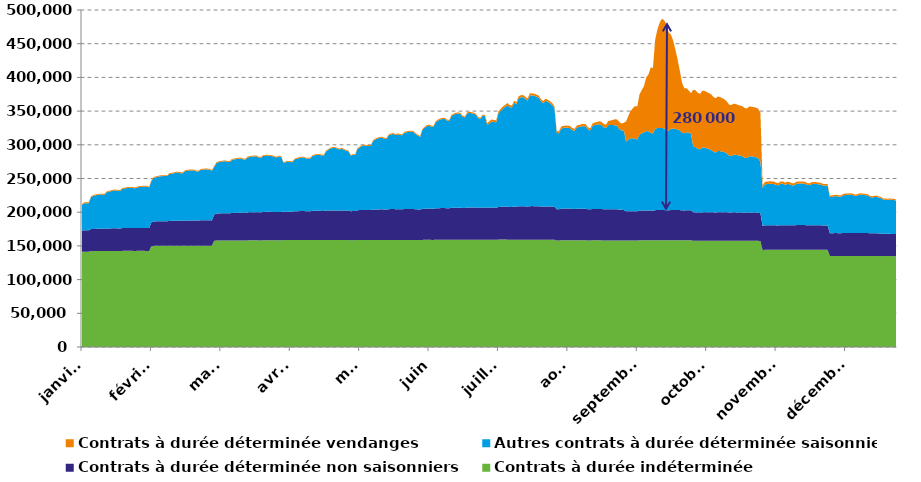
| Category | Contrats à durée indéterminée | Contrats à durée déterminée non saisonniers | Autres contrats à durée déterminée saisonniers | Contrats à durée déterminée vendanges |
|---|---|---|---|---|
| janvier | 141117 | 31510 | 38198 | 1278 |
| janvier | 141502 | 31786 | 40086 | 1282 |
| janvier | 141489 | 31743 | 40183 | 1281 |
| janvier | 141477 | 31708 | 40238 | 1281 |
| janvier | 142179 | 32746 | 47316 | 1327 |
| janvier | 142261 | 32906 | 48820 | 1330 |
| janvier | 142293 | 32949 | 49689 | 1332 |
| janvier | 142324 | 33006 | 50367 | 1333 |
| janvier | 142340 | 33022 | 50820 | 1336 |
| janvier | 142313 | 32969 | 50683 | 1334 |
| janvier | 142301 | 32940 | 50630 | 1334 |
| janvier | 142457 | 33341 | 53659 | 1341 |
| janvier | 142499 | 33431 | 54517 | 1343 |
| janvier | 142504 | 33492 | 55185 | 1344 |
| janvier | 142555 | 33581 | 55997 | 1345 |
| janvier | 142529 | 33579 | 56105 | 1344 |
| janvier | 142477 | 33471 | 55743 | 1341 |
| janvier | 142468 | 33442 | 55686 | 1341 |
| janvier | 142622 | 33810 | 57917 | 1344 |
| janvier | 142641 | 33882 | 58726 | 1343 |
| janvier | 142654 | 33921 | 59135 | 1341 |
| janvier | 142651 | 33945 | 59508 | 1345 |
| janvier | 142642 | 33945 | 59572 | 1341 |
| janvier | 142604 | 33879 | 59226 | 1336 |
| janvier | 142596 | 33865 | 59206 | 1333 |
| janvier | 142657 | 34041 | 60270 | 1334 |
| janvier | 142647 | 34062 | 60708 | 1336 |
| janvier | 142641 | 34089 | 61092 | 1334 |
| janvier | 142617 | 34107 | 61245 | 1334 |
| janvier | 142599 | 34091 | 61166 | 1332 |
| janvier | 142538 | 33958 | 60202 | 1326 |
| février | 149557 | 35525 | 61177 | 1347 |
| février | 150037 | 36196 | 64528 | 1350 |
| février | 150070 | 36342 | 65362 | 1355 |
| février | 150089 | 36434 | 66019 | 1355 |
| février | 150107 | 36500 | 66679 | 1357 |
| février | 150104 | 36530 | 66909 | 1359 |
| février | 150079 | 36459 | 67054 | 1358 |
| février | 150066 | 36444 | 67035 | 1357 |
| février | 150195 | 36894 | 69413 | 1360 |
| février | 150201 | 36981 | 70002 | 1361 |
| février | 150205 | 37051 | 70422 | 1359 |
| février | 150206 | 37098 | 71239 | 1359 |
| février | 150206 | 37125 | 71273 | 1356 |
| février | 150165 | 37004 | 70735 | 1352 |
| février | 150157 | 36988 | 70634 | 1350 |
| février | 150271 | 37417 | 73096 | 1354 |
| février | 150295 | 37487 | 73682 | 1357 |
| février | 150295 | 37516 | 74171 | 1353 |
| février | 150296 | 37556 | 74146 | 1355 |
| février | 150265 | 37569 | 74138 | 1353 |
| février | 150225 | 37409 | 72913 | 1349 |
| février | 150217 | 37377 | 72639 | 1349 |
| février | 150294 | 37723 | 74647 | 1356 |
| février | 150279 | 37782 | 75059 | 1356 |
| février | 150267 | 37798 | 75315 | 1356 |
| février | 150255 | 37796 | 75268 | 1357 |
| février | 150238 | 37787 | 75011 | 1356 |
| février | 150181 | 37563 | 73493 | 1352 |
| mars | 157490 | 38965 | 70534 | 1324 |
| mars | 157959 | 39990 | 74693 | 1330 |
| mars | 157994 | 40160 | 75979 | 1336 |
| mars | 158016 | 40283 | 76419 | 1337 |
| mars | 158037 | 40396 | 76838 | 1336 |
| mars | 158041 | 40425 | 77119 | 1335 |
| mars | 158009 | 40342 | 76371 | 1328 |
| mars | 158003 | 40324 | 76141 | 1326 |
| mars | 158131 | 40760 | 78715 | 1334 |
| mars | 158125 | 40891 | 79372 | 1334 |
| mars | 158117 | 40951 | 79779 | 1330 |
| mars | 158119 | 41028 | 80291 | 1331 |
| mars | 158104 | 41089 | 80306 | 1325 |
| mars | 158069 | 40947 | 79307 | 1315 |
| mars | 158057 | 40950 | 79079 | 1314 |
| mars | 158197 | 41508 | 81454 | 1318 |
| mars | 158213 | 41672 | 82088 | 1311 |
| mars | 158227 | 41766 | 82492 | 1309 |
| mars | 158227 | 41842 | 82667 | 1307 |
| mars | 158232 | 41861 | 82552 | 1301 |
| mars | 158182 | 41741 | 81205 | 1295 |
| mars | 158173 | 41704 | 80911 | 1295 |
| mars | 158267 | 42145 | 83217 | 1300 |
| mars | 158301 | 42218 | 83247 | 1300 |
| mars | 158299 | 42248 | 83207 | 1297 |
| mars | 158294 | 42253 | 83044 | 1296 |
| mars | 158277 | 42242 | 82570 | 1293 |
| mars | 158228 | 42091 | 81425 | 1283 |
| mars | 158208 | 42046 | 81048 | 1280 |
| mars | 158242 | 42236 | 82040 | 1280 |
| mars | 158226 | 42203 | 81306 | 1274 |
| avril | 158646 | 42044 | 72327 | 1240 |
| avril | 158664 | 42139 | 73367 | 1245 |
| avril | 158665 | 42171 | 73932 | 1245 |
| avril | 158637 | 42115 | 73616 | 1243 |
| avril | 158620 | 42100 | 73513 | 1244 |
| avril | 158771 | 42622 | 76893 | 1250 |
| avril | 158779 | 42716 | 77977 | 1252 |
| avril | 158787 | 42801 | 78718 | 1252 |
| avril | 158804 | 42891 | 79274 | 1249 |
| avril | 158807 | 42912 | 79317 | 1246 |
| avril | 158736 | 42730 | 78313 | 1243 |
| avril | 158722 | 42710 | 78088 | 1243 |
| avril | 158730 | 42709 | 78321 | 1243 |
| avril | 158844 | 43176 | 81264 | 1248 |
| avril | 158870 | 43334 | 82345 | 1254 |
| avril | 158846 | 43329 | 82838 | 1249 |
| avril | 158837 | 43325 | 83100 | 1250 |
| avril | 158808 | 43124 | 82303 | 1247 |
| avril | 158790 | 43047 | 82273 | 1247 |
| avril | 158888 | 43545 | 87783 | 1255 |
| avril | 158882 | 43634 | 89931 | 1256 |
| avril | 158873 | 43685 | 91952 | 1255 |
| avril | 158861 | 43722 | 92730 | 1256 |
| avril | 158847 | 43712 | 92991 | 1256 |
| avril | 158797 | 43559 | 91845 | 1256 |
| avril | 158784 | 43499 | 90824 | 1255 |
| avril | 158812 | 43697 | 91557 | 1263 |
| avril | 158810 | 43655 | 90240 | 1265 |
| avril | 158784 | 43632 | 88573 | 1266 |
| avril | 158760 | 43617 | 87986 | 1267 |
| mai | 158353 | 43135 | 82483 | 1259 |
| mai | 158414 | 43234 | 83212 | 1261 |
| mai | 158418 | 43223 | 83165 | 1261 |
| mai | 158763 | 44203 | 90587 | 1323 |
| mai | 158786 | 44368 | 92829 | 1332 |
| mai | 158807 | 44562 | 94649 | 1342 |
| mai | 158806 | 44589 | 95616 | 1348 |
| mai | 158774 | 44501 | 94784 | 1347 |
| mai | 158782 | 44516 | 94996 | 1347 |
| mai | 158763 | 44501 | 94881 | 1347 |
| mai | 158858 | 45059 | 101645 | 1386 |
| mai | 158864 | 45183 | 103699 | 1399 |
| mai | 158843 | 45258 | 105142 | 1406 |
| mai | 158841 | 45333 | 106083 | 1411 |
| mai | 158853 | 45391 | 106209 | 1412 |
| mai | 158795 | 45248 | 104975 | 1412 |
| mai | 158784 | 45203 | 104765 | 1411 |
| mai | 158881 | 45631 | 109564 | 1439 |
| mai | 158887 | 45739 | 110764 | 1444 |
| mai | 158888 | 45794 | 111343 | 1447 |
| mai | 158852 | 45653 | 109859 | 1444 |
| mai | 158858 | 45710 | 110919 | 1446 |
| mai | 158836 | 45612 | 110052 | 1445 |
| mai | 158829 | 45565 | 109623 | 1446 |
| mai | 158886 | 45872 | 113034 | 1462 |
| mai | 158879 | 45925 | 113832 | 1470 |
| mai | 158881 | 45958 | 114348 | 1476 |
| mai | 158861 | 45961 | 114662 | 1474 |
| mai | 158855 | 45863 | 114204 | 1471 |
| mai | 158807 | 45564 | 111559 | 1467 |
| mai | 158769 | 45381 | 109541 | 1464 |
| juin | 158690 | 45228 | 107515 | 1504 |
| juin | 158926 | 46030 | 116941 | 1543 |
| juin | 158962 | 46227 | 120085 | 1548 |
| juin | 158972 | 46375 | 122162 | 1557 |
| juin | 158969 | 46430 | 123014 | 1559 |
| juin | 158939 | 46295 | 121786 | 1557 |
| juin | 158922 | 46254 | 121334 | 1558 |
| juin | 159033 | 46712 | 128058 | 1577 |
| juin | 159042 | 46845 | 130046 | 1589 |
| juin | 159048 | 46994 | 131442 | 1599 |
| juin | 159043 | 47036 | 132153 | 1607 |
| juin | 159034 | 47060 | 132368 | 1609 |
| juin | 158986 | 46846 | 130069 | 1605 |
| juin | 158963 | 46792 | 129489 | 1605 |
| juin | 159107 | 47397 | 136341 | 1630 |
| juin | 159108 | 47446 | 138104 | 1626 |
| juin | 159113 | 47546 | 139231 | 1632 |
| juin | 159126 | 47590 | 139787 | 1639 |
| juin | 159111 | 47553 | 139020 | 1638 |
| juin | 159077 | 47301 | 135268 | 1620 |
| juin | 159056 | 47224 | 134243 | 1617 |
| juin | 159124 | 47743 | 139598 | 1646 |
| juin | 159123 | 47857 | 140360 | 1651 |
| juin | 159117 | 47956 | 139671 | 1653 |
| juin | 159095 | 48001 | 138974 | 1649 |
| juin | 159076 | 48004 | 137290 | 1646 |
| juin | 159025 | 47716 | 132582 | 1636 |
| juin | 159007 | 47647 | 132071 | 1636 |
| juin | 159038 | 48078 | 135974 | 1659 |
| juin | 159023 | 48119 | 135338 | 1662 |
| juillet | 159209 | 47404 | 122459 | 3082 |
| juillet | 159217 | 47558 | 125347 | 3095 |
| juillet | 159231 | 47694 | 127609 | 3098 |
| juillet | 159182 | 47546 | 127020 | 3079 |
| juillet | 159168 | 47514 | 126708 | 3074 |
| juillet | 159317 | 48435 | 139022 | 3121 |
| juillet | 159340 | 48639 | 142336 | 3133 |
| juillet | 159340 | 48747 | 145623 | 3140 |
| juillet | 159334 | 48928 | 147979 | 3139 |
| juillet | 159297 | 48987 | 150618 | 3139 |
| juillet | 159219 | 48667 | 148074 | 3113 |
| juillet | 159206 | 48614 | 147361 | 3111 |
| juillet | 159236 | 49121 | 153844 | 3122 |
| juillet | 159211 | 49038 | 151807 | 3115 |
| juillet | 159286 | 49634 | 159848 | 3143 |
| juillet | 159253 | 49663 | 161498 | 3141 |
| juillet | 159243 | 49675 | 161896 | 3141 |
| juillet | 159185 | 49402 | 159368 | 3118 |
| juillet | 159173 | 49279 | 157249 | 3118 |
| juillet | 159239 | 49723 | 164260 | 3136 |
| juillet | 159244 | 49785 | 164180 | 3138 |
| juillet | 159247 | 49742 | 163694 | 3134 |
| juillet | 159240 | 49658 | 162585 | 3129 |
| juillet | 159230 | 49599 | 161024 | 3119 |
| juillet | 159173 | 49264 | 156115 | 3099 |
| juillet | 159171 | 49150 | 153371 | 3097 |
| juillet | 159204 | 49411 | 156876 | 3111 |
| juillet | 159193 | 49421 | 155157 | 3108 |
| juillet | 159177 | 49353 | 153219 | 3107 |
| juillet | 159148 | 49183 | 150549 | 3103 |
| juillet | 159126 | 49025 | 146288 | 3099 |
| août | 158073 | 46416 | 113390 | 2995 |
| août | 158061 | 46298 | 112559 | 2996 |
| août | 158239 | 47067 | 118689 | 3011 |
| août | 158264 | 47175 | 119494 | 3015 |
| août | 158280 | 47192 | 120067 | 3021 |
| août | 158279 | 47143 | 119928 | 3024 |
| août | 158280 | 47091 | 119330 | 3035 |
| août | 158226 | 46761 | 116749 | 3026 |
| août | 158212 | 46652 | 115844 | 3025 |
| août | 158261 | 46943 | 120469 | 3047 |
| août | 158255 | 46912 | 121233 | 3098 |
| août | 158247 | 46933 | 122168 | 3184 |
| août | 158244 | 46887 | 122594 | 3231 |
| août | 158228 | 46806 | 122251 | 3288 |
| août | 158166 | 46275 | 118210 | 3273 |
| août | 158146 | 46127 | 117074 | 3278 |
| août | 158238 | 46561 | 123047 | 3601 |
| août | 158221 | 46623 | 124429 | 3770 |
| août | 158219 | 46623 | 125118 | 4025 |
| août | 158212 | 46646 | 125551 | 4522 |
| août | 158192 | 46569 | 124549 | 4809 |
| août | 158150 | 46273 | 121687 | 4909 |
| août | 158138 | 46138 | 120602 | 4862 |
| août | 158196 | 46353 | 124602 | 6122 |
| août | 158186 | 46358 | 124763 | 6740 |
| août | 158173 | 46348 | 124808 | 7481 |
| août | 158168 | 46318 | 124563 | 8891 |
| août | 158152 | 46244 | 123578 | 9679 |
| août | 158099 | 45653 | 119317 | 10610 |
| août | 158073 | 45437 | 117690 | 10426 |
| août | 158074 | 45267 | 117930 | 11489 |
| septembre | 158030 | 43213 | 103690 | 29739 |
| septembre | 158064 | 43356 | 106258 | 35120 |
| septembre | 158099 | 43445 | 108047 | 40726 |
| septembre | 158124 | 43471 | 108319 | 44115 |
| septembre | 158108 | 43328 | 107238 | 49035 |
| septembre | 158089 | 43262 | 106608 | 48710 |
| septembre | 158294 | 43916 | 113064 | 59616 |
| septembre | 158328 | 44066 | 114521 | 64261 |
| septembre | 158344 | 44187 | 115884 | 68785 |
| septembre | 158356 | 44329 | 117735 | 79658 |
| septembre | 158340 | 44335 | 117271 | 84512 |
| septembre | 158309 | 44122 | 115146 | 96961 |
| septembre | 158291 | 44006 | 114300 | 97850 |
| septembre | 158470 | 44561 | 120797 | 132137 |
| septembre | 158515 | 44718 | 121792 | 146284 |
| septembre | 158482 | 44721 | 121596 | 156469 |
| septembre | 158484 | 44741 | 121805 | 161932 |
| septembre | 158459 | 44697 | 121083 | 160648 |
| septembre | 158428 | 44454 | 118785 | 157249 |
| septembre | 158407 | 44339 | 118026 | 146326 |
| septembre | 158505 | 44688 | 120584 | 140051 |
| septembre | 158513 | 44733 | 120718 | 131043 |
| septembre | 158519 | 44761 | 120344 | 118143 |
| septembre | 158514 | 44707 | 119605 | 104020 |
| septembre | 158499 | 44626 | 118166 | 88598 |
| septembre | 158442 | 44329 | 115159 | 74088 |
| septembre | 158424 | 44209 | 114273 | 67005 |
| septembre | 158478 | 44391 | 115771 | 65430 |
| septembre | 158470 | 44377 | 115036 | 62611 |
| septembre | 158458 | 44337 | 113594 | 60322 |
| octobre | 157565 | 42194 | 97180 | 84809 |
| octobre | 157561 | 42217 | 96849 | 84401 |
| octobre | 157517 | 42017 | 94458 | 83205 |
| octobre | 157499 | 41949 | 93675 | 82351 |
| octobre | 157629 | 42370 | 96082 | 84072 |
| octobre | 157617 | 42428 | 95833 | 84239 |
| octobre | 157624 | 42422 | 94651 | 83759 |
| octobre | 157629 | 42390 | 93657 | 83022 |
| octobre | 157599 | 42335 | 92509 | 82383 |
| octobre | 157551 | 42133 | 89917 | 81354 |
| octobre | 157515 | 42084 | 88886 | 80687 |
| octobre | 157627 | 42421 | 90835 | 80763 |
| octobre | 157606 | 42470 | 90535 | 80281 |
| octobre | 157609 | 42425 | 89744 | 79454 |
| octobre | 157616 | 42444 | 88997 | 78248 |
| octobre | 157570 | 42268 | 87195 | 77155 |
| octobre | 157520 | 41968 | 84253 | 75880 |
| octobre | 157499 | 41882 | 83690 | 75728 |
| octobre | 157606 | 42170 | 85446 | 75832 |
| octobre | 157591 | 42161 | 85350 | 75438 |
| octobre | 157575 | 42071 | 84671 | 74713 |
| octobre | 157565 | 42042 | 84126 | 74465 |
| octobre | 157548 | 41980 | 83437 | 74166 |
| octobre | 157499 | 41794 | 81418 | 73816 |
| octobre | 157479 | 41741 | 81066 | 73766 |
| octobre | 157535 | 41955 | 83452 | 73818 |
| octobre | 157526 | 41969 | 83400 | 73705 |
| octobre | 157520 | 41933 | 82859 | 73628 |
| octobre | 157493 | 41884 | 82207 | 73501 |
| octobre | 157475 | 41776 | 80966 | 73302 |
| octobre | 157340 | 41220 | 76199 | 72788 |
| novembre | 143728 | 35761 | 56836 | 3743 |
| novembre | 144167 | 36396 | 60559 | 3767 |
| novembre | 144198 | 36438 | 61204 | 3731 |
| novembre | 144215 | 36466 | 61401 | 3709 |
| novembre | 144212 | 36474 | 61409 | 3677 |
| novembre | 144198 | 36474 | 61069 | 3630 |
| novembre | 144150 | 36284 | 59990 | 3470 |
| novembre | 144134 | 36220 | 59486 | 3441 |
| novembre | 144242 | 36535 | 61328 | 3457 |
| novembre | 144249 | 36563 | 61272 | 3419 |
| novembre | 144231 | 36422 | 59907 | 3313 |
| novembre | 144258 | 36537 | 61024 | 3338 |
| novembre | 144243 | 36557 | 60675 | 3306 |
| novembre | 144178 | 36365 | 59396 | 3209 |
| novembre | 144167 | 36322 | 59088 | 3179 |
| novembre | 144298 | 36531 | 61197 | 3205 |
| novembre | 144301 | 36587 | 61488 | 3171 |
| novembre | 144301 | 36578 | 61666 | 3141 |
| novembre | 144298 | 36569 | 61612 | 3087 |
| novembre | 144292 | 36551 | 61182 | 3024 |
| novembre | 144232 | 36339 | 59767 | 2826 |
| novembre | 144212 | 36292 | 59592 | 2818 |
| novembre | 144280 | 36469 | 61140 | 2809 |
| novembre | 144276 | 36497 | 61314 | 2762 |
| novembre | 144260 | 36477 | 61102 | 2711 |
| novembre | 144245 | 36437 | 60706 | 2680 |
| novembre | 144230 | 36390 | 60214 | 2654 |
| novembre | 144176 | 36150 | 59105 | 2601 |
| novembre | 144167 | 36098 | 58946 | 2595 |
| novembre | 144170 | 36116 | 59232 | 2593 |
| décembre | 135034 | 33767 | 53489 | 2164 |
| décembre | 135057 | 33827 | 54134 | 2155 |
| décembre | 135073 | 33890 | 54558 | 2144 |
| décembre | 135082 | 33896 | 54640 | 2132 |
| décembre | 135052 | 33832 | 54101 | 2108 |
| décembre | 135033 | 33809 | 53971 | 2105 |
| décembre | 135114 | 34058 | 55887 | 2107 |
| décembre | 135116 | 34132 | 56306 | 2105 |
| décembre | 135118 | 34172 | 56491 | 2098 |
| décembre | 135104 | 34202 | 56643 | 2092 |
| décembre | 135078 | 34175 | 56394 | 2084 |
| décembre | 135029 | 34042 | 55367 | 2058 |
| décembre | 135013 | 34004 | 55106 | 2055 |
| décembre | 135064 | 34180 | 56495 | 2052 |
| décembre | 135076 | 34214 | 56718 | 2048 |
| décembre | 135040 | 34154 | 56356 | 2030 |
| décembre | 135026 | 34139 | 56003 | 2018 |
| décembre | 135005 | 34074 | 55513 | 1988 |
| décembre | 134946 | 33731 | 53667 | 1878 |
| décembre | 134930 | 33657 | 53273 | 1876 |
| décembre | 134955 | 33750 | 53895 | 1874 |
| décembre | 134936 | 33731 | 53706 | 1859 |
| décembre | 134914 | 33619 | 53152 | 1839 |
| décembre | 134885 | 33444 | 52052 | 1801 |
| décembre | 134861 | 33083 | 50593 | 1764 |
| décembre | 134852 | 33041 | 50580 | 1762 |
| décembre | 134838 | 33009 | 50437 | 1760 |
| décembre | 134840 | 33003 | 50752 | 1760 |
| décembre | 134817 | 32956 | 50506 | 1755 |
| décembre | 134808 | 32894 | 50069 | 1743 |
| décembre | 134758 | 32772 | 48921 | 1721 |